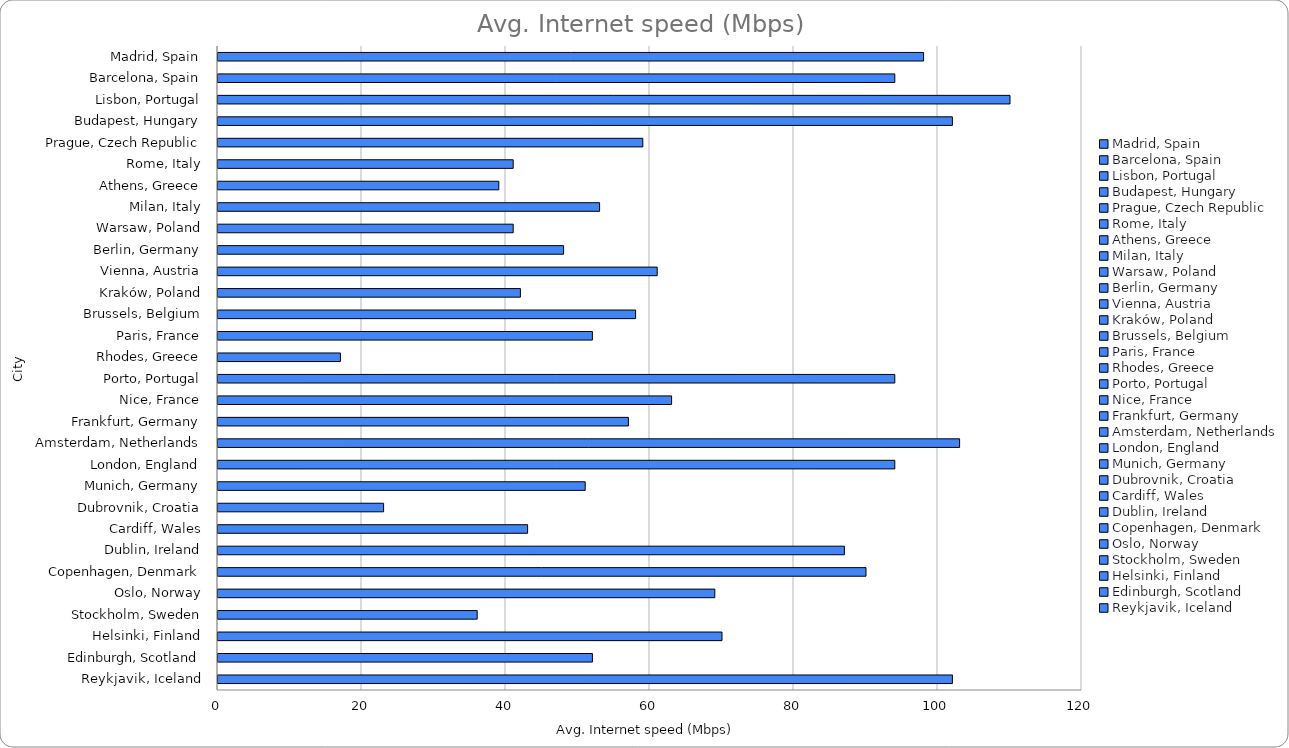
| Category | Avg. Internet speed (Mbps) |
|---|---|
| Madrid, Spain | 98 |
| Barcelona, Spain | 94 |
| Lisbon, Portugal | 110 |
| Budapest, Hungary | 102 |
| Prague, Czech Republic | 59 |
| Rome, Italy | 41 |
| Athens, Greece | 39 |
| Milan, Italy | 53 |
| Warsaw, Poland | 41 |
| Berlin, Germany | 48 |
| Vienna, Austria | 61 |
| Kraków, Poland | 42 |
| Brussels, Belgium | 58 |
| Paris, France | 52 |
| Rhodes, Greece | 17 |
| Porto, Portugal | 94 |
| Nice, France | 63 |
| Frankfurt, Germany | 57 |
| Amsterdam, Netherlands | 103 |
| London, England | 94 |
| Munich, Germany | 51 |
| Dubrovnik, Croatia | 23 |
| Cardiff, Wales | 43 |
| Dublin, Ireland | 87 |
| Copenhagen, Denmark | 90 |
| Oslo, Norway | 69 |
| Stockholm, Sweden | 36 |
| Helsinki, Finland | 70 |
| Edinburgh, Scotland | 52 |
| Reykjavik, Iceland | 102 |